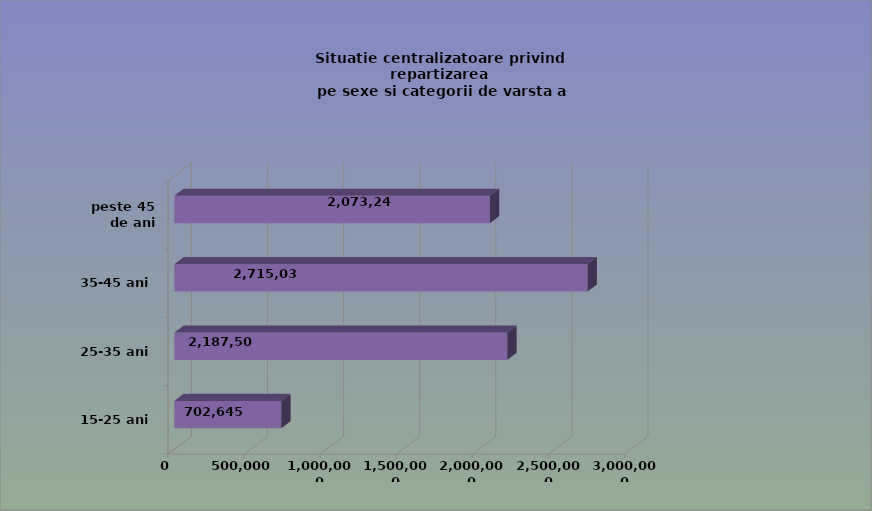
| Category | 15-25 ani 25-35 ani 35-45 ani peste 45 de ani |
|---|---|
| 15-25 ani | 702645 |
| 25-35 ani | 2187508 |
| 35-45 ani | 2715033 |
| peste 45 de ani | 2073249 |